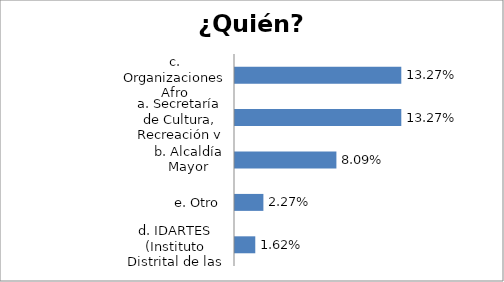
| Category | Series 0 |
|---|---|
| d. IDARTES (Instituto Distrital de las Artes) | 0.016 |
| e. Otro | 0.023 |
| b. Alcaldía Mayor | 0.081 |
| a. Secretaría de Cultura, Recreación y Deporte | 0.133 |
| c. Organizaciones Afro | 0.133 |